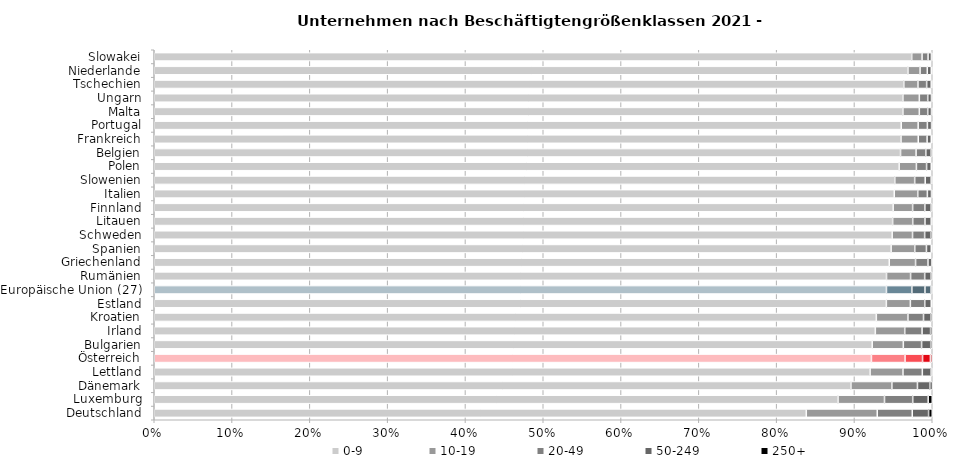
| Category | 0-9  | 10-19 | 20-49 | 50-249 | 250+ |
|---|---|---|---|---|---|
| Deutschland | 0.838 | 0.091 | 0.045 | 0.021 | 0.005 |
| Luxemburg | 0.879 | 0.06 | 0.036 | 0.02 | 0.005 |
| Dänemark | 0.895 | 0.053 | 0.033 | 0.016 | 0.003 |
| Lettland | 0.92 | 0.042 | 0.025 | 0.011 | 0.002 |
| Österreich | 0.922 | 0.043 | 0.023 | 0.01 | 0.002 |
| Bulgarien | 0.923 | 0.04 | 0.023 | 0.012 | 0.002 |
| Irland | 0.927 | 0.038 | 0.022 | 0.011 | 0.002 |
| Kroatien | 0.928 | 0.041 | 0.02 | 0.009 | 0.002 |
| Estland | 0.941 | 0.031 | 0.018 | 0.008 | 0.001 |
| Europäische Union (27) | 0.941 | 0.033 | 0.017 | 0.008 | 0.002 |
| Rumänien | 0.941 | 0.031 | 0.018 | 0.008 | 0.002 |
| Griechenland | 0.945 | 0.034 | 0.016 | 0.005 | 0.001 |
| Spanien | 0.947 | 0.03 | 0.015 | 0.006 | 0.001 |
| Schweden | 0.948 | 0.026 | 0.016 | 0.008 | 0.002 |
| Litauen | 0.949 | 0.026 | 0.016 | 0.008 | 0.001 |
| Finnland | 0.95 | 0.025 | 0.016 | 0.008 | 0.002 |
| Italien | 0.951 | 0.03 | 0.012 | 0.005 | 0.001 |
| Slowenien | 0.952 | 0.026 | 0.014 | 0.008 | 0.001 |
| Polen | 0.957 | 0.022 | 0.013 | 0.006 | 0.001 |
| Belgien | 0.959 | 0.02 | 0.013 | 0.007 | 0.002 |
| Frankreich | 0.96 | 0.022 | 0.011 | 0.005 | 0.001 |
| Portugal | 0.96 | 0.022 | 0.012 | 0.005 | 0.001 |
| Malta | 0.962 | 0.021 | 0.011 | 0.005 | 0.001 |
| Ungarn | 0.962 | 0.021 | 0.011 | 0.005 | 0.001 |
| Tschechien | 0.963 | 0.018 | 0.011 | 0.006 | 0.001 |
| Niederlande | 0.969 | 0.016 | 0.009 | 0.005 | 0.001 |
| Slowakei | 0.974 | 0.013 | 0.008 | 0.004 | 0.001 |